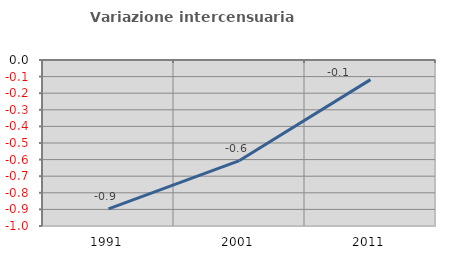
| Category | Variazione intercensuaria annua |
|---|---|
| 1991.0 | -0.897 |
| 2001.0 | -0.606 |
| 2011.0 | -0.118 |